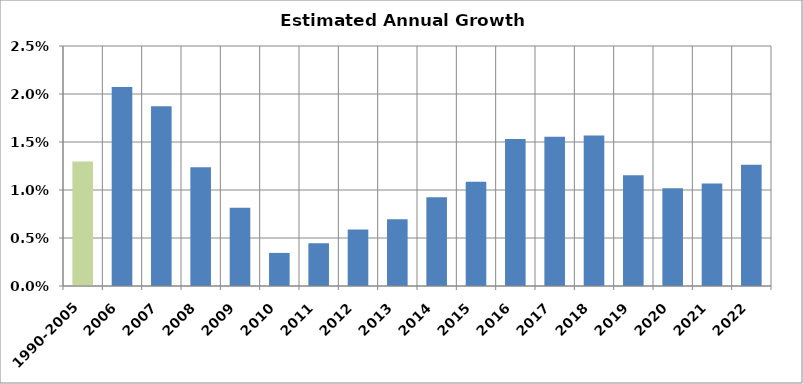
| Category | Annual Growth Estimates |
|---|---|
| 1990-2005 | 0.013 |
| 2006 | 0.021 |
| 2007 | 0.019 |
| 2008 | 0.012 |
| 2009 | 0.008 |
| 2010 | 0.003 |
| 2011 | 0.004 |
| 2012 | 0.006 |
| 2013 | 0.007 |
| 2014 | 0.009 |
| 2015 | 0.011 |
| 2016 | 0.015 |
| 2017 | 0.016 |
| 2018 | 0.016 |
| 2019 | 0.012 |
| 2020 | 0.01 |
| 2021 | 0.011 |
| 2022 | 0.013 |